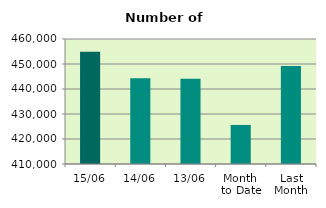
| Category | Series 0 |
|---|---|
| 15/06 | 454854 |
| 14/06 | 444342 |
| 13/06 | 444080 |
| Month 
to Date | 425628.364 |
| Last
Month | 449234.545 |